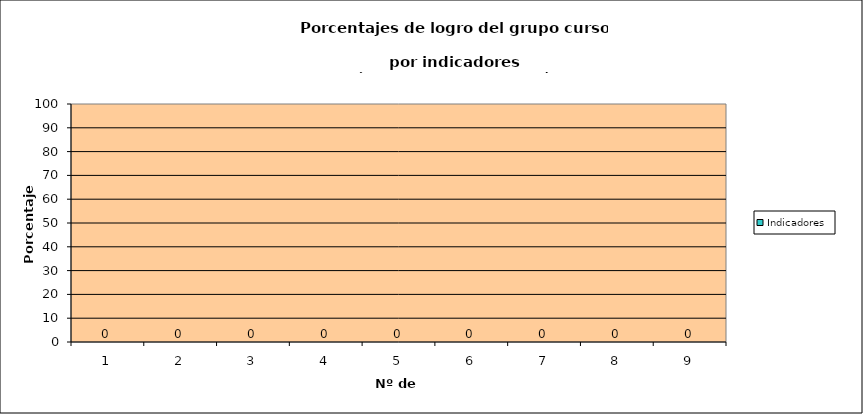
| Category | Indicadores |
|---|---|
| 0 | 0 |
| 1 | 0 |
| 2 | 0 |
| 3 | 0 |
| 4 | 0 |
| 5 | 0 |
| 6 | 0 |
| 7 | 0 |
| 8 | 0 |